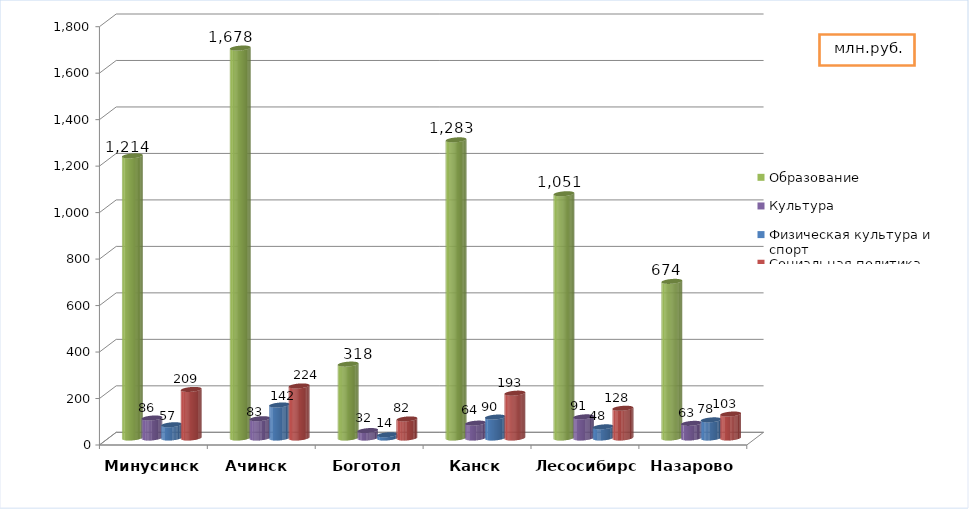
| Category | Образование | Культура | Физическая культура и спорт | Социальная политика |
|---|---|---|---|---|
| Минусинск | 1214 | 86 | 57 | 209 |
| Ачинск  | 1678 | 83 | 142 | 224 |
| Боготол | 318 | 32 | 14 | 82 |
| Канск | 1283 | 64 | 90 | 193 |
| Лесосибирск | 1051 | 91 | 48 | 128 |
| Назарово | 674 | 63 | 78 | 103 |